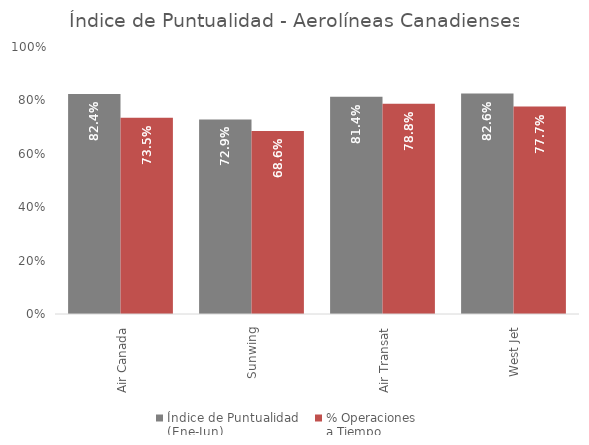
| Category | Índice de Puntualidad
(Ene-Jun) | % Operaciones 
a Tiempo |
|---|---|---|
| Air Canada | 0.824 | 0.735 |
| Sunwing | 0.729 | 0.686 |
| Air Transat | 0.814 | 0.788 |
| West Jet | 0.826 | 0.777 |